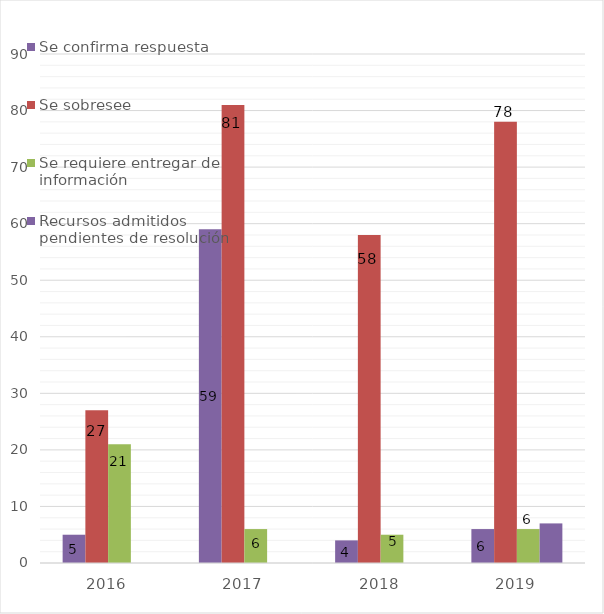
| Category | Se confirma respuesta | Se sobresee  | Se requiere entregar de información  | Recursos admitidos pendientes de resolución |
|---|---|---|---|---|
| 2016.0 | 5 | 27 | 21 | 0 |
| 2017.0 | 59 | 81 | 6 | 0 |
| 2018.0 | 4 | 58 | 5 | 0 |
| 2019.0 | 6 | 78 | 6 | 7 |